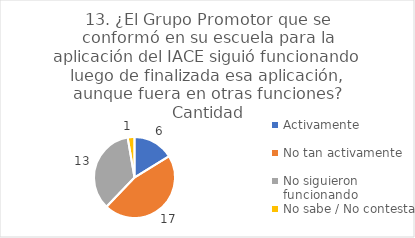
| Category | 13. ¿El Grupo Promotor que se conformó en su escuela para la aplicación del IACE siguió funcionando luego de finalizada esa aplicación, aunque fuera en otras funciones? |
|---|---|
| Activamente  | 0.162 |
| No tan activamente  | 0.459 |
| No siguieron funcionando  | 0.351 |
| No sabe / No contesta | 0.027 |